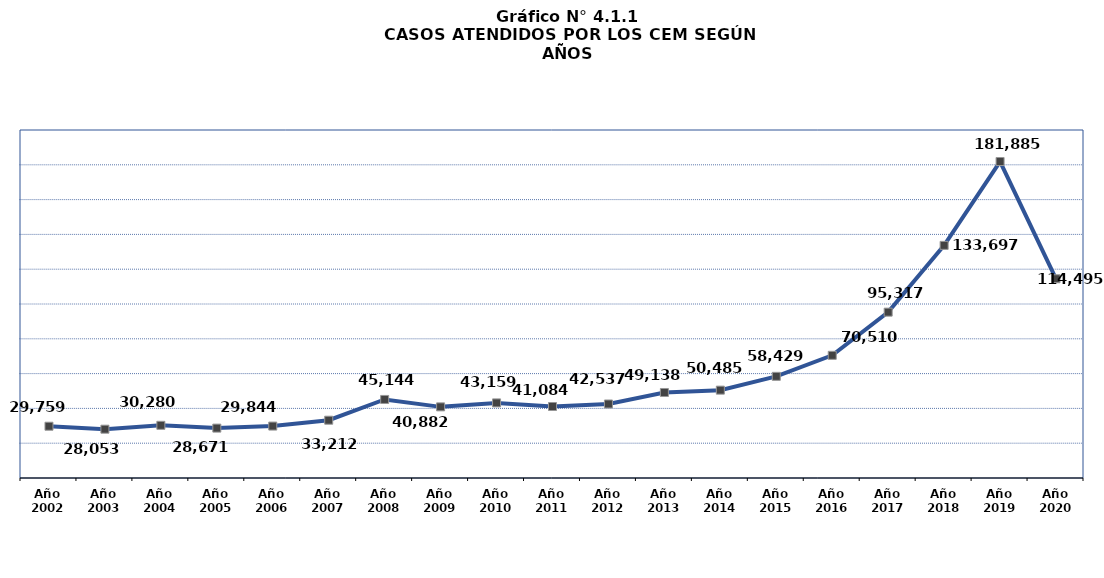
| Category | Series 0 |
|---|---|
| Año 2002 | 29759 |
| Año 2003 | 28053 |
| Año 2004 | 30280 |
| Año 2005 | 28671 |
| Año 2006 | 29844 |
| Año 2007 | 33212 |
| Año 2008 | 45144 |
| Año 2009 | 40882 |
| Año 2010 | 43159 |
| Año 2011 | 41084 |
| Año 2012 | 42537 |
| Año 2013 | 49138 |
| Año 2014 | 50485 |
| Año 2015 | 58429 |
| Año 2016 | 70510 |
| Año 2017 | 95317 |
| Año 2018 | 133697 |
| Año 2019 | 181885 |
| Año 2020 | 114495 |